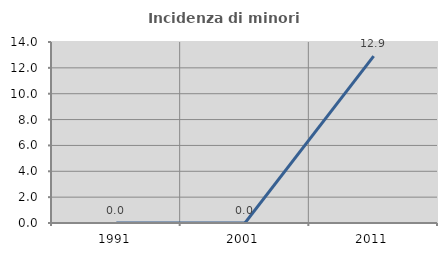
| Category | Incidenza di minori stranieri |
|---|---|
| 1991.0 | 0 |
| 2001.0 | 0 |
| 2011.0 | 12.903 |